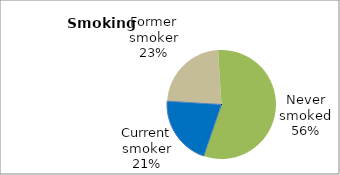
| Category | Series 0 |
|---|---|
| Current smoker | 20.684 |
| Former smoker | 23.027 |
| Never smoked | 56.29 |